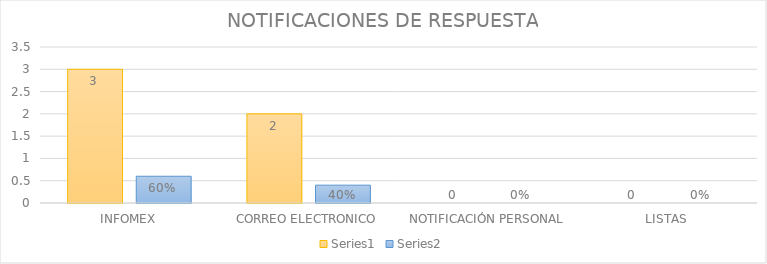
| Category | Series 3 | Series 4 |
|---|---|---|
| INFOMEX | 3 | 0.6 |
| CORREO ELECTRONICO | 2 | 0.4 |
| NOTIFICACIÓN PERSONAL | 0 | 0 |
| LISTAS | 0 | 0 |